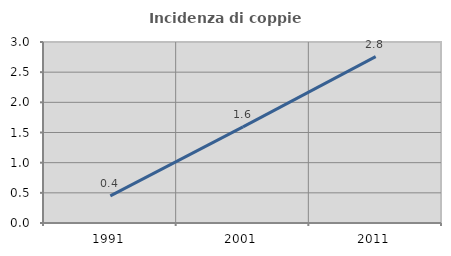
| Category | Incidenza di coppie miste |
|---|---|
| 1991.0 | 0.449 |
| 2001.0 | 1.594 |
| 2011.0 | 2.758 |